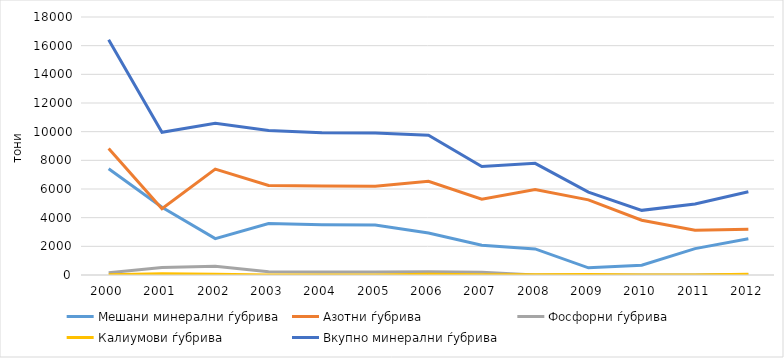
| Category | Мешани минерални ѓубрива | Азотни ѓубрива | Фосфорни ѓубрива | Калиумови ѓубрива | Вкупно минерални ѓубрива |
|---|---|---|---|---|---|
| 2000.0 | 7409 | 8833 | 161 | 13 | 16416 |
| 2001.0 | 4732 | 4625 | 515 | 81 | 9953 |
| 2002.0 | 2536 | 7386 | 618 | 53 | 10593 |
| 2003.0 | 3588 | 6250 | 234 | 2 | 10074 |
| 2004.0 | 3498 | 6217 | 213 | 3 | 9931 |
| 2005.0 | 3488 | 6200 | 211 | 1 | 9900 |
| 2006.0 | 2935 | 6537 | 230 | 44 | 9746 |
| 2007.0 | 2077 | 5293 | 189 | 10 | 7569 |
| 2008.0 | 1820 | 5957 | 1 | 12 | 7790 |
| 2009.0 | 498.66 | 5242.02 | 1 | 40.03 | 5781.71 |
| 2010.0 | 680.899 | 3819.2 | 7.2 | 2.955 | 4510.254 |
| 2011.0 | 1840.574 | 3117.3 | 0 | 0 | 4957.874 |
| 2012.0 | 2523.882 | 3200.15 | 36.5 | 48.34 | 5808.872 |